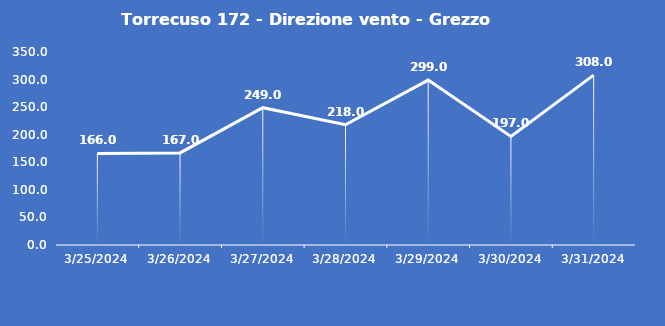
| Category | Torrecuso 172 - Direzione vento - Grezzo (°N) |
|---|---|
| 3/25/24 | 166 |
| 3/26/24 | 167 |
| 3/27/24 | 249 |
| 3/28/24 | 218 |
| 3/29/24 | 299 |
| 3/30/24 | 197 |
| 3/31/24 | 308 |